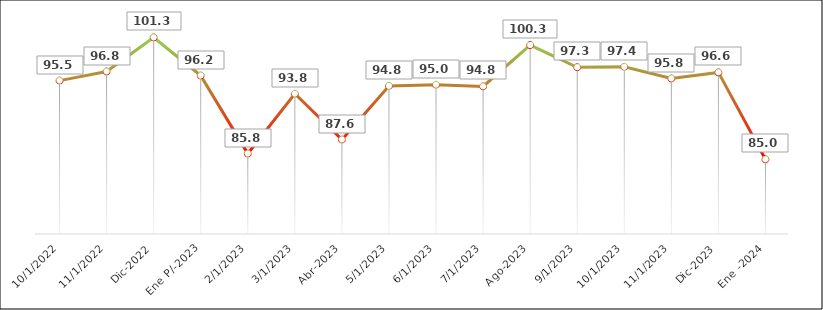
| Category |  Índice  |
|---|---|
| Oct-2022 | 95.539 |
| Nov-2022 | 96.758 |
| Dic-2022 | 101.319 |
| Ene P/-2023 | 96.214 |
| Feb-2023 | 85.763 |
| Mar-2023 | 93.78 |
| Abr-2023 | 87.638 |
| May-2023 | 94.827 |
| Jun-2023 | 94.981 |
| Jul-2023 | 94.762 |
| Ago-2023 | 100.301 |
| Sep-2023 | 97.333 |
| Oct-2023 | 97.383 |
| Nov-2023 | 95.82 |
| Dic-2023 | 96.642 |
| Ene -2024 | 84.993 |